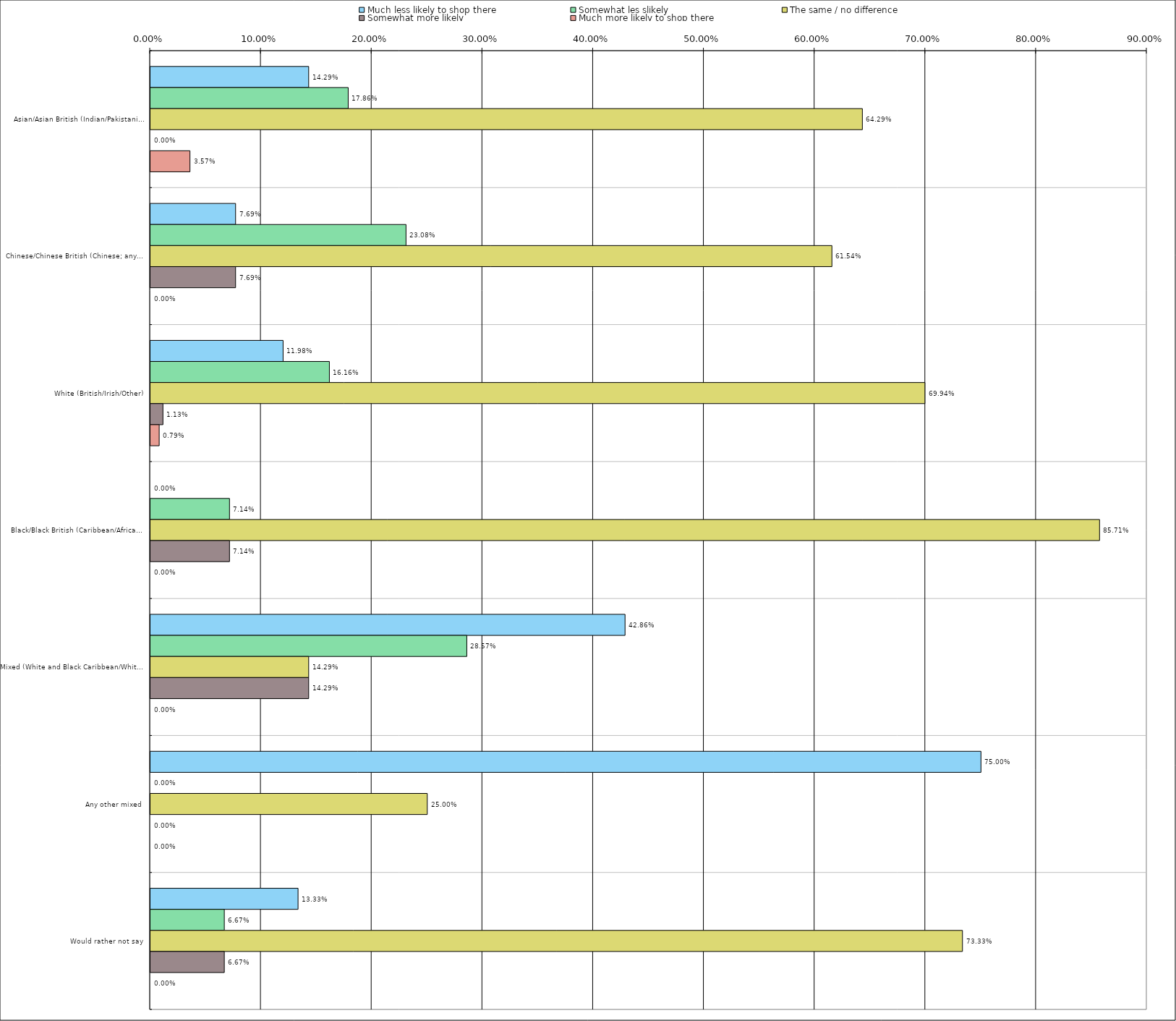
| Category | Much less likely to shop there | Somewhat les slikely | The same / no difference | Somewhat more likely | Much more likely to shop there |
|---|---|---|---|---|---|
| 0 | 0.143 | 0.179 | 0.643 | 0 | 0.036 |
| 1 | 0.077 | 0.231 | 0.615 | 0.077 | 0 |
| 2 | 0.12 | 0.162 | 0.699 | 0.011 | 0.008 |
| 3 | 0 | 0.071 | 0.857 | 0.071 | 0 |
| 4 | 0.429 | 0.286 | 0.143 | 0.143 | 0 |
| 5 | 0.75 | 0 | 0.25 | 0 | 0 |
| 6 | 0.133 | 0.067 | 0.733 | 0.067 | 0 |